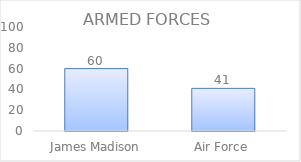
| Category | Series 0 |
|---|---|
| James Madison | 60 |
| Air Force | 41 |